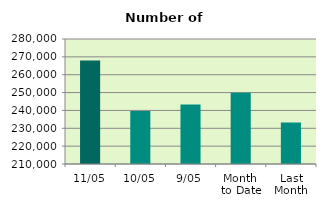
| Category | Series 0 |
|---|---|
| 11/05 | 267986 |
| 10/05 | 239688 |
| 9/05 | 243358 |
| Month 
to Date | 249884 |
| Last
Month | 233247 |